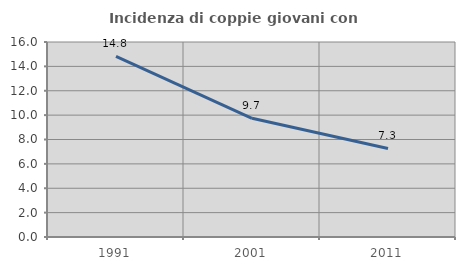
| Category | Incidenza di coppie giovani con figli |
|---|---|
| 1991.0 | 14.815 |
| 2001.0 | 9.74 |
| 2011.0 | 7.266 |